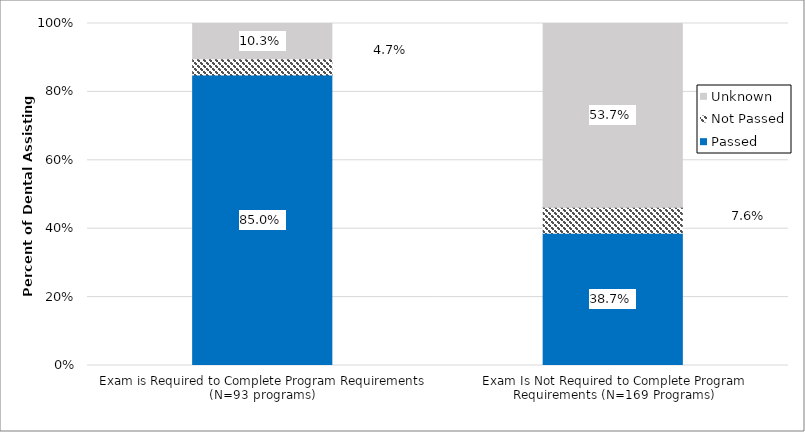
| Category | Passed | Not Passed | Unknown |
|---|---|---|---|
| Exam is Required to Complete Program Requirements (N=93 programs) | 0.85 | 0.047 | 0.103 |
| Exam Is Not Required to Complete Program Requirements (N=169 Programs) | 0.387 | 0.076 | 0.537 |